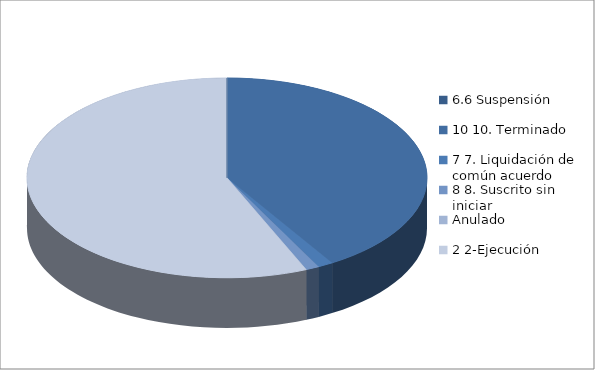
| Category | Series 0 |
|---|---|
| 6.6 Suspensión | 0 |
| 10 10. Terminado | 337 |
| 7 7. Liquidación de común acuerdo | 10 |
| 8 8. Suscrito sin iniciar | 9 |
| Anulado | 0 |
| 2 2-Ejecución | 462 |